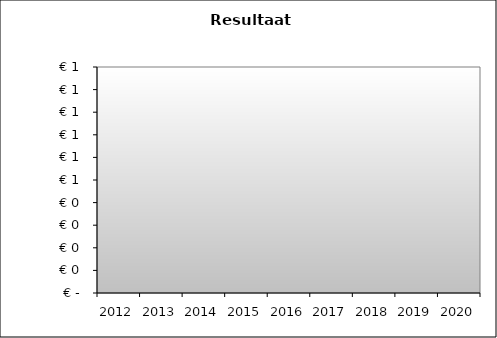
| Category | Series 0 |
|---|---|
| 2012.0 | 0 |
| 2013.0 | 0 |
| 2014.0 | 0 |
| 2015.0 | 0 |
| 2016.0 | 0 |
| 2017.0 | 0 |
| 2018.0 | 0 |
| 2019.0 | 0 |
| 2020.0 | 0 |